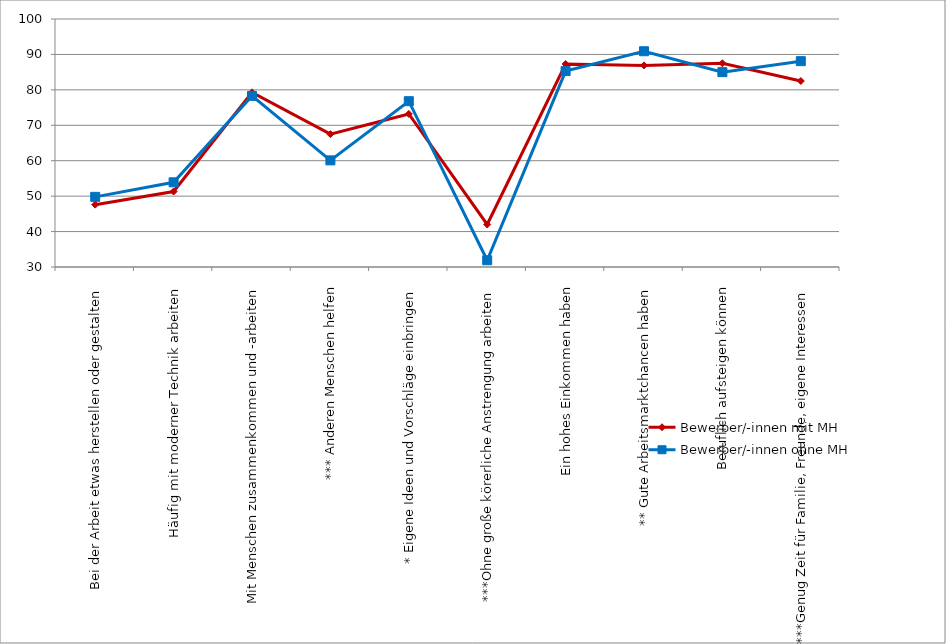
| Category | Bewerber/-innen mit MH | Bewerber/-innen ohne MH |
|---|---|---|
| Bei der Arbeit etwas herstellen oder gestalten | 47.6 | 49.8 |
| Häufig mit moderner Technik arbeiten | 51.3 | 53.9 |
| Mit Menschen zusammenkommen und -arbeiten | 79.3 | 78.3 |
| *** Anderen Menschen helfen | 67.5 | 60.1 |
| * Eigene Ideen und Vorschläge einbringen | 73.2 | 76.8 |
| ***Ohne große körerliche Anstrengung arbeiten | 42 | 31.9 |
| Ein hohes Einkommen haben | 87.3 | 85.3 |
| ** Gute Arbeitsmarktchancen haben | 86.9 | 90.9 |
| Beruflich aufsteigen können | 87.5 | 85 |
| ***Genug Zeit für Familie, Freunde, eigene Interessen | 82.5 | 88.1 |